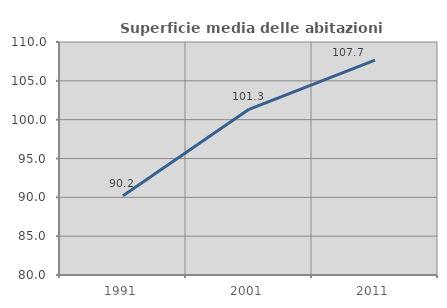
| Category | Superficie media delle abitazioni occupate |
|---|---|
| 1991.0 | 90.203 |
| 2001.0 | 101.333 |
| 2011.0 | 107.678 |